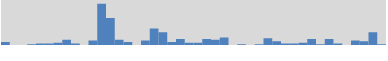
| Category | 4 |
|---|---|
| 40490.78288194445 | 4 |
| 40490.951107611974 | 0 |
| 40491.1193332795 | 0 |
| 40491.28755894703 | 1 |
| 40491.455784614554 | 2 |
| 40491.62401028208 | 2 |
| 40491.79223594961 | 3 |
| 40491.960461617135 | 7 |
| 40492.12868728466 | 2 |
| 40492.29691295219 | 0 |
| 40492.465138619715 | 6 |
| 40492.63336428724 | 55 |
| 40492.80158995477 | 36 |
| 40492.969815622295 | 7 |
| 40493.13804128982 | 4 |
| 40493.30626695735 | 0 |
| 40493.474492624875 | 6 |
| 40493.6427182924 | 22 |
| 40493.81094395993 | 17 |
| 40493.979169627455 | 4 |
| 40494.14739529498 | 8 |
| 40494.31562096251 | 3 |
| 40494.483846630035 | 3 |
| 40494.65207229756 | 8 |
| 40494.82029796509 | 7 |
| 40494.988523632615 | 10 |
| 40495.15674930014 | 0 |
| 40495.32497496767 | 1 |
| 40495.493200635196 | 0 |
| 40495.66142630272 | 1 |
| 40495.82965197025 | 9 |
| 40495.997877637776 | 5 |
| 40496.1661033053 | 2 |
| 40496.33432897283 | 2 |
| 40496.502554640356 | 3 |
| 40496.67078030788 | 8 |
| 40496.83900597541 | 1 |
| 40497.007231642936 | 8 |
| 40497.17545731046 | 2 |
| 40497.34368297799 | 0 |
| 40497.511908645516 | 6 |
| 40497.68013431304 | 5 |
| 40497.84835998057 | 17 |
| 40498.01658564815 | 1 |